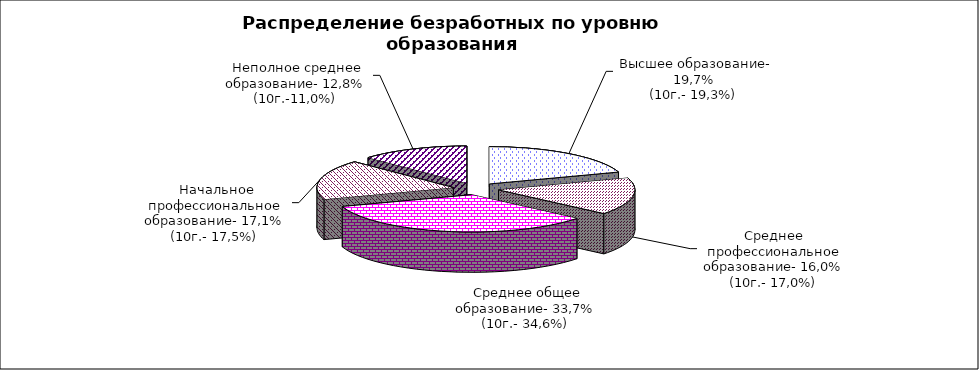
| Category | Series 0 |
|---|---|
|  - высшее образование | 19.7 |
|  - среднее профессиональное образование | 16 |
|  - среднее общее образование | 33.7 |
|  - начальное профессиональное образование | 17.1 |
|  - неполное среднее образование | 12.8 |